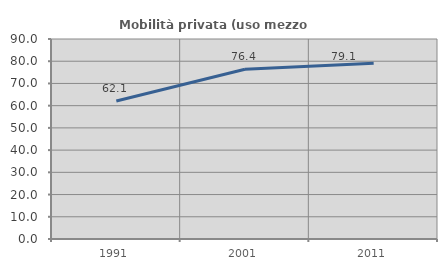
| Category | Mobilità privata (uso mezzo privato) |
|---|---|
| 1991.0 | 62.069 |
| 2001.0 | 76.374 |
| 2011.0 | 79.062 |